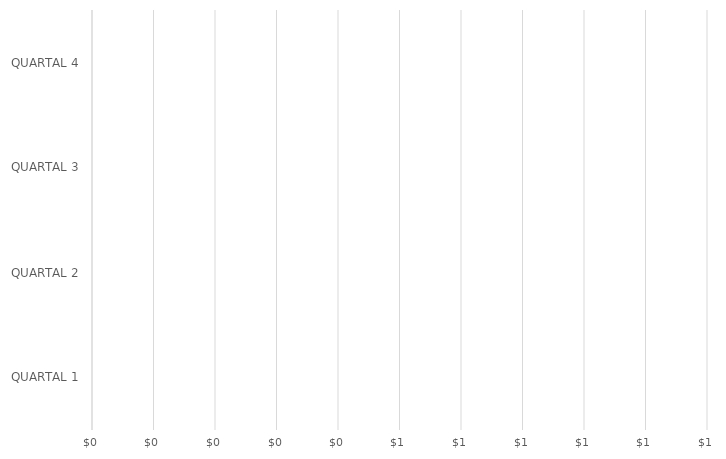
| Category | Series 0 |
|---|---|
| QUARTAL 1 | 0 |
| QUARTAL 2 | 0 |
| QUARTAL 3 | 0 |
| QUARTAL 4 | 0 |